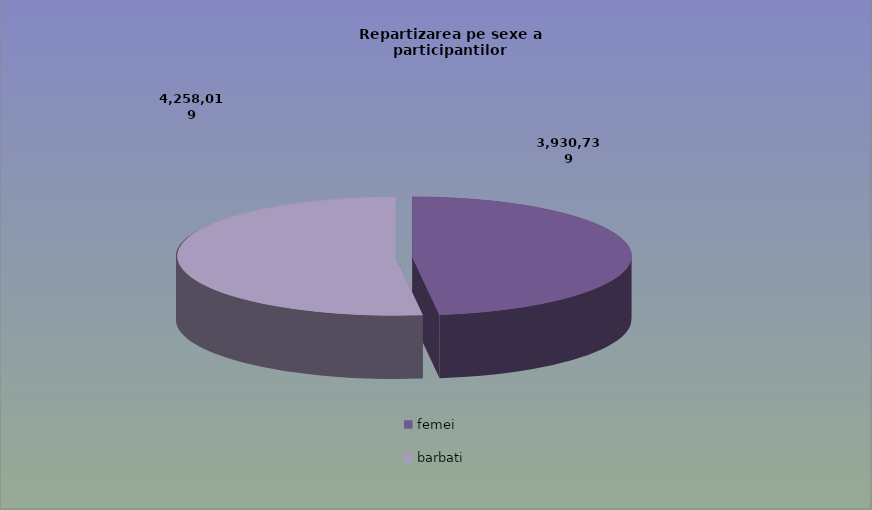
| Category | Series 0 |
|---|---|
| femei | 3930739 |
| barbati | 4258019 |